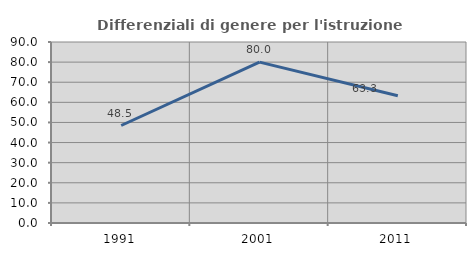
| Category | Differenziali di genere per l'istruzione superiore |
|---|---|
| 1991.0 | 48.479 |
| 2001.0 | 80 |
| 2011.0 | 63.25 |